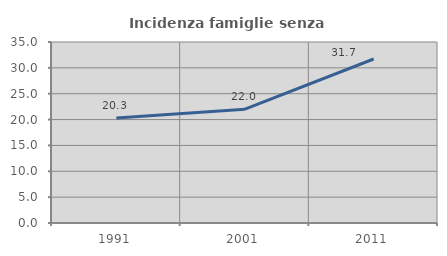
| Category | Incidenza famiglie senza nuclei |
|---|---|
| 1991.0 | 20.327 |
| 2001.0 | 22.009 |
| 2011.0 | 31.712 |